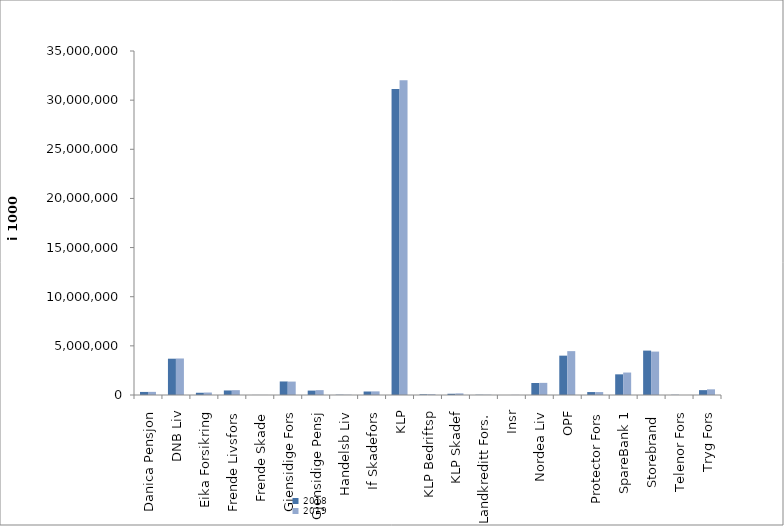
| Category | 2018 | 2019 |
|---|---|---|
| Danica Pensjon | 311903.856 | 317604.171 |
| DNB Liv | 3693482 | 3715260.492 |
| Eika Forsikring | 228170 | 252371 |
| Frende Livsfors | 463177 | 491735 |
| Frende Skade | 6101 | 6362.257 |
| Gjensidige Fors | 1376815 | 1365659 |
| Gjensidige Pensj | 448350 | 495734 |
| Handelsb Liv | 27672 | 26625.803 |
| If Skadefors | 354933.206 | 368992.594 |
| KLP | 31138078.291 | 32032545.142 |
| KLP Bedriftsp | 66367 | 74207 |
| KLP Skadef | 126445.983 | 163742.539 |
| Landkreditt Fors. | 24377 | 28648 |
| Insr | 1079 | 12781.715 |
| Nordea Liv | 1223827.073 | 1234767.866 |
| OPF | 4003368.515 | 4463574 |
| Protector Fors | 299297.717 | 298592.884 |
| SpareBank 1 | 2103059.959 | 2285218.036 |
| Storebrand  | 4517436.409 | 4417928.83 |
| Telenor Fors | 20446 | 0 |
| Tryg Fors | 494563 | 577343.847 |